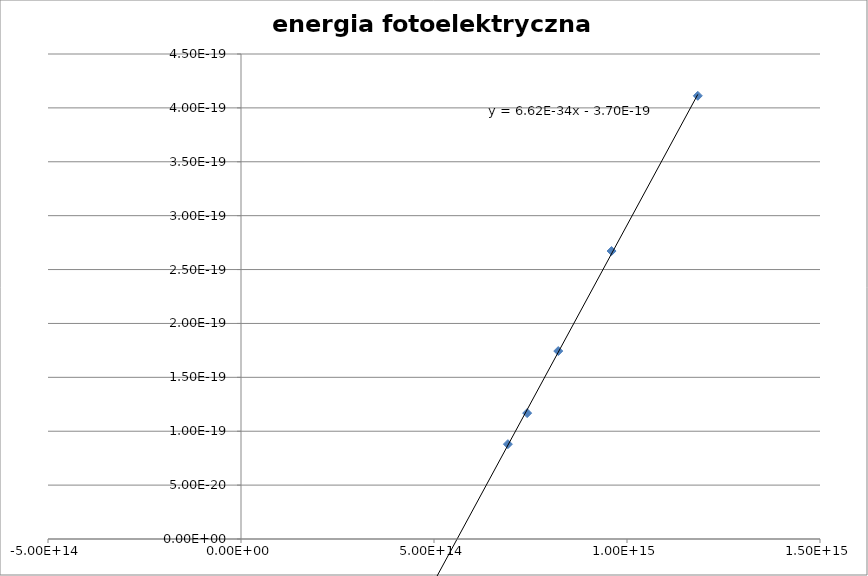
| Category | energia fotoelektryczna E[J] |
|---|---|
| 691403549204886.0 | 0 |
| 741289844329132.6 | 0 |
| 821917808219178.1 | 0 |
| 959999999999999.9 | 0 |
| 1183431952662722.0 | 0 |